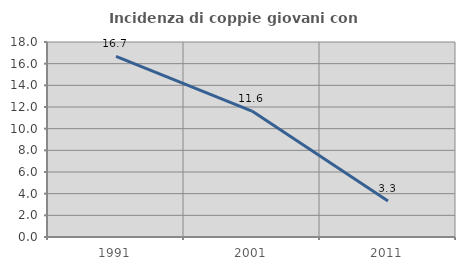
| Category | Incidenza di coppie giovani con figli |
|---|---|
| 1991.0 | 16.667 |
| 2001.0 | 11.628 |
| 2011.0 | 3.333 |